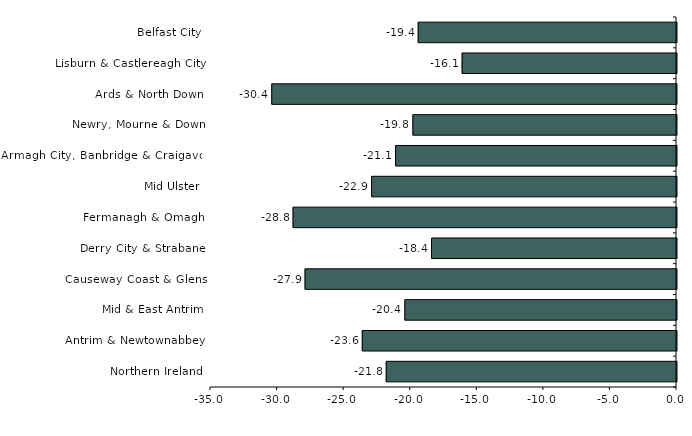
| Category | Series 0 |
|---|---|
| Belfast City | -19.4 |
| Lisburn & Castlereagh City | -16.1 |
| Ards & North Down | -30.4 |
| Newry, Mourne & Down | -19.8 |
| Armagh City, Banbridge & Craigavon | -21.1 |
| Mid Ulster | -22.9 |
| Fermanagh & Omagh | -28.8 |
| Derry City & Strabane | -18.4 |
| Causeway Coast & Glens | -27.9 |
| Mid & East Antrim | -20.4 |
| Antrim & Newtownabbey | -23.6 |
| Northern Ireland | -21.8 |